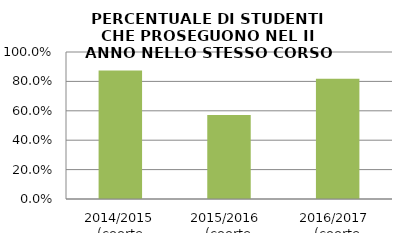
| Category | 2014/2015 (coorte 2013/14) 2015/2016  (coorte 2014/15) 2016/2017  (coorte 2015/16) |
|---|---|
| 2014/2015 (coorte 2013/14) | 0.875 |
| 2015/2016  (coorte 2014/15) | 0.571 |
| 2016/2017  (coorte 2015/16) | 0.818 |